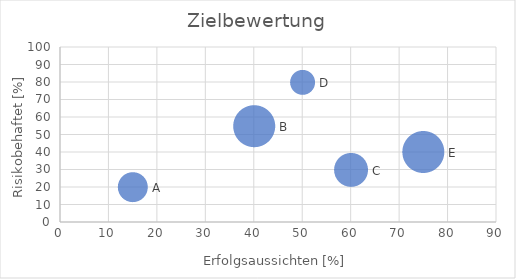
| Category | Risiko
[%] |
|---|---|
| 15.0 | 20 |
| 40.0 | 55 |
| 60.0 | 30 |
| 50.0 | 80 |
| 75.0 | 40 |